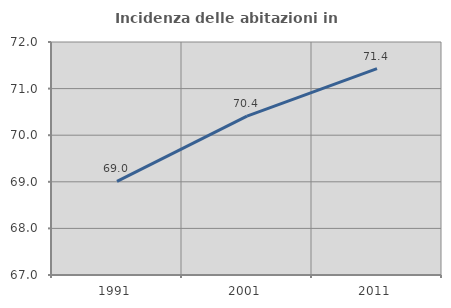
| Category | Incidenza delle abitazioni in proprietà  |
|---|---|
| 1991.0 | 69.007 |
| 2001.0 | 70.411 |
| 2011.0 | 71.429 |